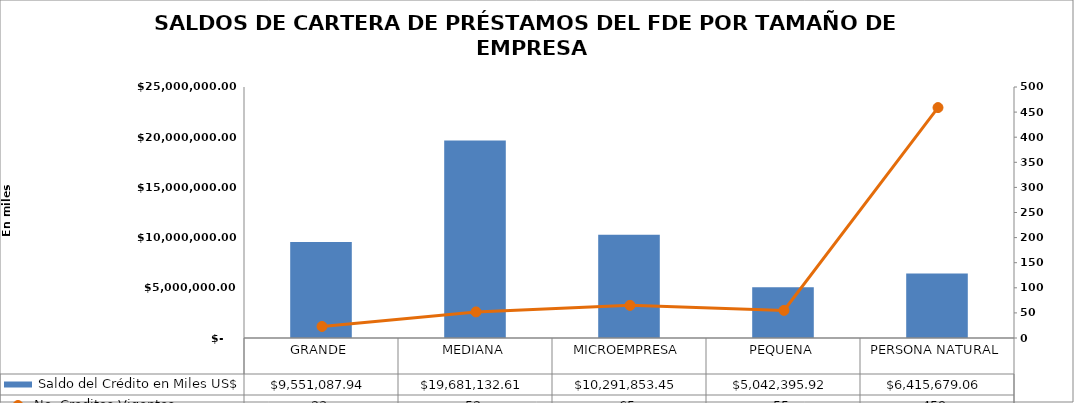
| Category |  Saldo del Crédito en Miles US$ |
|---|---|
| GRANDE | 9551087.94 |
| MEDIANA | 19681132.61 |
| MICROEMPRESA | 10291853.45 |
| PEQUENA | 5042395.92 |
| PERSONA NATURAL | 6415679.06 |